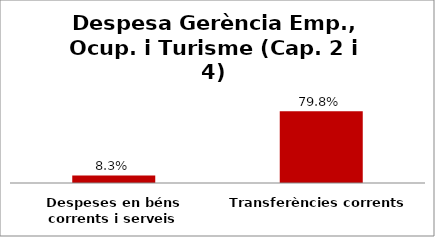
| Category | Series 0 |
|---|---|
| Despeses en béns corrents i serveis | 0.083 |
| Transferències corrents | 0.798 |